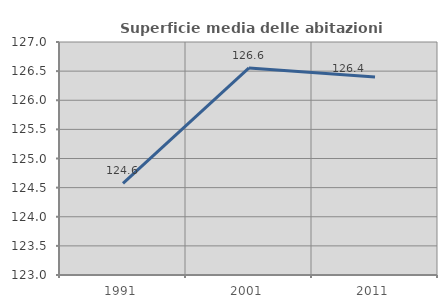
| Category | Superficie media delle abitazioni occupate |
|---|---|
| 1991.0 | 124.573 |
| 2001.0 | 126.554 |
| 2011.0 | 126.401 |